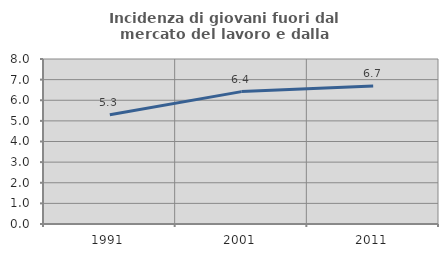
| Category | Incidenza di giovani fuori dal mercato del lavoro e dalla formazione  |
|---|---|
| 1991.0 | 5.297 |
| 2001.0 | 6.419 |
| 2011.0 | 6.695 |